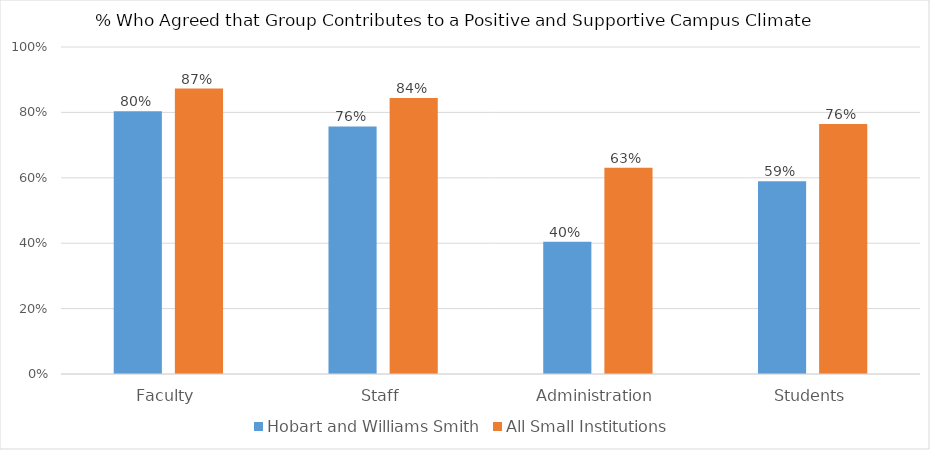
| Category | Hobart and Williams Smith | All Small Institutions |
|---|---|---|
| Faculty | 0.803 | 0.873 |
| Staff | 0.757 | 0.844 |
| Administration | 0.405 | 0.631 |
| Students | 0.59 | 0.765 |